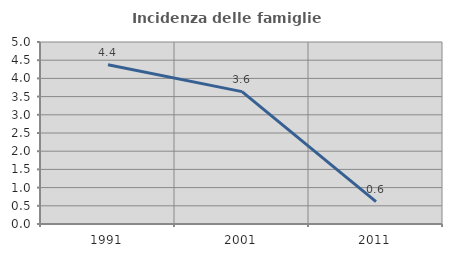
| Category | Incidenza delle famiglie numerose |
|---|---|
| 1991.0 | 4.375 |
| 2001.0 | 3.636 |
| 2011.0 | 0.613 |